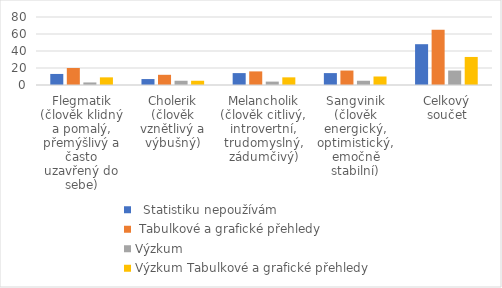
| Category |   Statistiku nepoužívám |  Tabulkové a grafické přehledy  | Výzkum   | Výzkum Tabulkové a grafické přehledy  |
|---|---|---|---|---|
| Flegmatik (člověk klidný a pomalý, přemýšlivý a často uzavřený do sebe) | 13 | 20 | 3 | 9 |
| Cholerik (člověk vznětlivý a výbušný) | 7 | 12 | 5 | 5 |
| Melancholik (člověk citlivý, introvertní, trudomyslný, zádumčivý) | 14 | 16 | 4 | 9 |
| Sangvinik (člověk energický, optimistický, emočně stabilní) | 14 | 17 | 5 | 10 |
| Celkový součet | 48 | 65 | 17 | 33 |